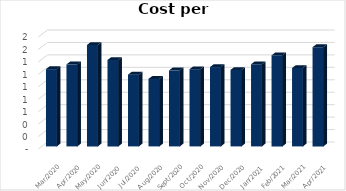
| Category | Cost / Conv |
|---|---|
| 2021-04-30 | 1.595 |
| 2021-03-31 | 1.26 |
| 2021-02-28 | 1.463 |
| 2021-01-31 | 1.32 |
| 2020-12-31 | 1.229 |
| 2020-11-30 | 1.275 |
| 2020-10-31 | 1.241 |
| 2020-09-30 | 1.222 |
| 2020-08-31 | 1.085 |
| 2020-07-31 | 1.153 |
| 2020-06-30 | 1.389 |
| 2020-05-31 | 1.63 |
| 2020-04-30 | 1.318 |
| 2020-03-31 | 1.242 |